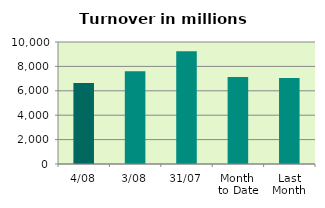
| Category | Series 0 |
|---|---|
| 4/08 | 6648.285 |
| 3/08 | 7607.475 |
| 31/07 | 9233.965 |
| Month 
to Date | 7127.88 |
| Last
Month | 7041.386 |